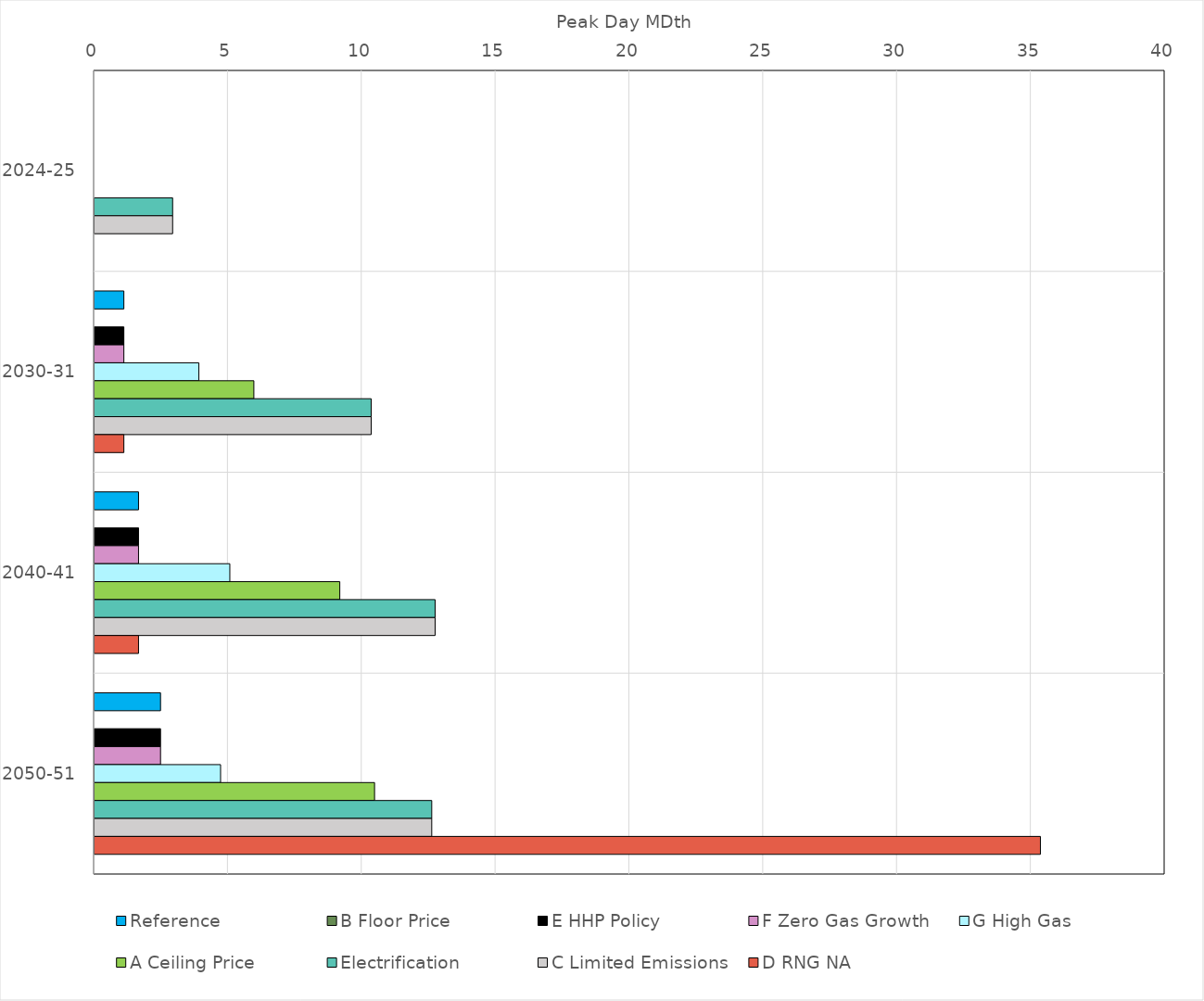
| Category | Reference | B Floor Price | E HHP Policy | F Zero Gas Growth | G High Gas | A Ceiling Price | Electrification | C Limited Emissions | D RNG NA |
|---|---|---|---|---|---|---|---|---|---|
| 2024-25 | 0 | 0 | 0 | 0 | 0 | 0 | 2.918 | 2.918 | 0 |
| 2030-31 | 1.096 | 0 | 1.096 | 1.096 | 3.899 | 5.953 | 10.337 | 10.337 | 1.096 |
| 2040-41 | 1.644 | 0 | 1.644 | 1.644 | 5.055 | 9.164 | 12.726 | 12.726 | 1.644 |
| 2050-51 | 2.466 | 0 | 2.466 | 2.466 | 4.71 | 10.463 | 12.6 | 12.6 | 35.342 |